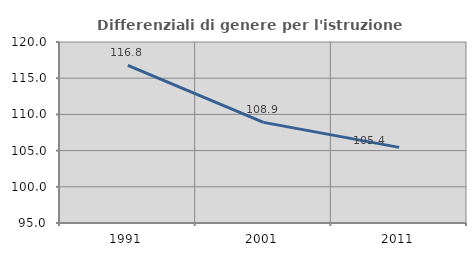
| Category | Differenziali di genere per l'istruzione superiore |
|---|---|
| 1991.0 | 116.769 |
| 2001.0 | 108.902 |
| 2011.0 | 105.447 |